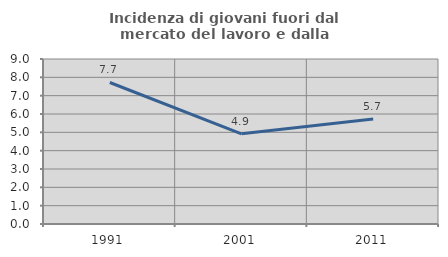
| Category | Incidenza di giovani fuori dal mercato del lavoro e dalla formazione  |
|---|---|
| 1991.0 | 7.718 |
| 2001.0 | 4.917 |
| 2011.0 | 5.727 |